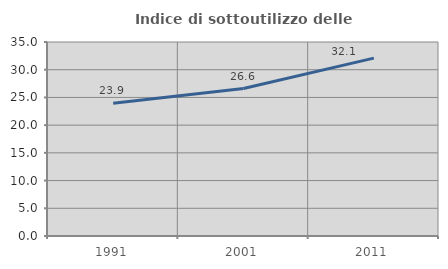
| Category | Indice di sottoutilizzo delle abitazioni  |
|---|---|
| 1991.0 | 23.935 |
| 2001.0 | 26.6 |
| 2011.0 | 32.09 |